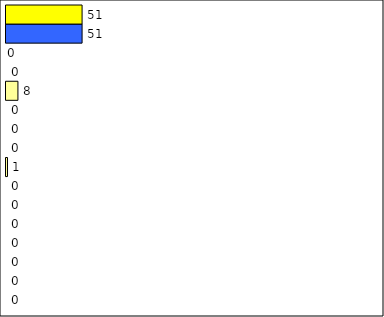
| Category | -2 | -1 | 0 | 1 | 2 | 3 | 4 | 5 | 6 | 7 | 8 | 9 | 10 | 11 | 12 | Perfect Round |
|---|---|---|---|---|---|---|---|---|---|---|---|---|---|---|---|---|
| 0 | 0 | 0 | 0 | 0 | 0 | 0 | 0 | 1 | 0 | 0 | 0 | 8 | 0 | 0 | 51 | 51 |